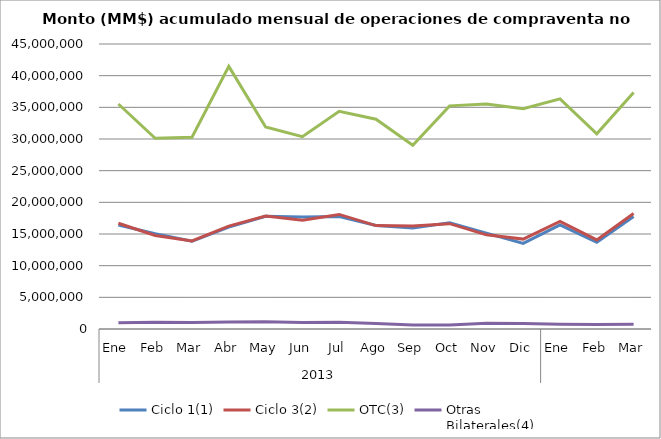
| Category | Ciclo 1(1) | Ciclo 3(2) | OTC(3) | Otras
Bilaterales(4) |
|---|---|---|---|---|
| 0 | 16417241.727 | 16700335.202 | 35523809.408 | 972958.086 |
| 1 | 15037741.172 | 14773657.586 | 30102338.851 | 1073496.596 |
| 2 | 13848943.779 | 13900402.205 | 30273669.122 | 1026617.054 |
| 3 | 16086096.035 | 16245696.168 | 41465554.082 | 1105720.368 |
| 4 | 17801790.619 | 17838763.351 | 31909646.654 | 1133512.85 |
| 5 | 17684542.956 | 17179330.609 | 30372188.279 | 1025162.543 |
| 6 | 17771623.451 | 18089502.524 | 34376831.202 | 1053340.718 |
| 7 | 16359818.954 | 16327115.519 | 33128143.288 | 882723.558 |
| 8 | 15949862.744 | 16281684.387 | 29025705.039 | 624893.462 |
| 9 | 16760948.703 | 16634867.291 | 35234004.542 | 641647.876 |
| 10 | 15133528.556 | 14863555.208 | 35512550.02 | 915020.525 |
| 11 | 13509827.678 | 14192849.668 | 34769513.126 | 877765.247 |
| 12 | 16434121.823 | 16973216.875 | 36341658.718 | 750147.378 |
| 13 | 13675521.943 | 14060199.134 | 30828680.35 | 721919.806 |
| 14 | 17760484.117 | 18231676.991 | 37344676.439 | 768460.999 |